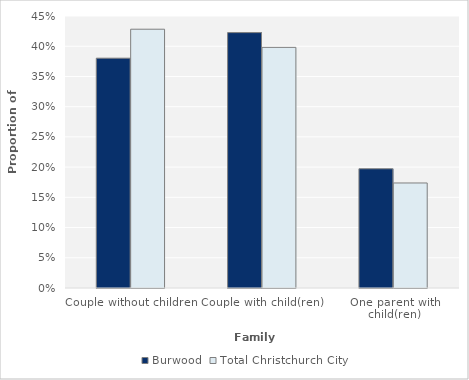
| Category | Burwood | Total Christchurch City |
|---|---|---|
| Couple without children | 0.38 | 0.428 |
| Couple with child(ren) | 0.423 | 0.398 |
| One parent with child(ren) | 0.197 | 0.174 |